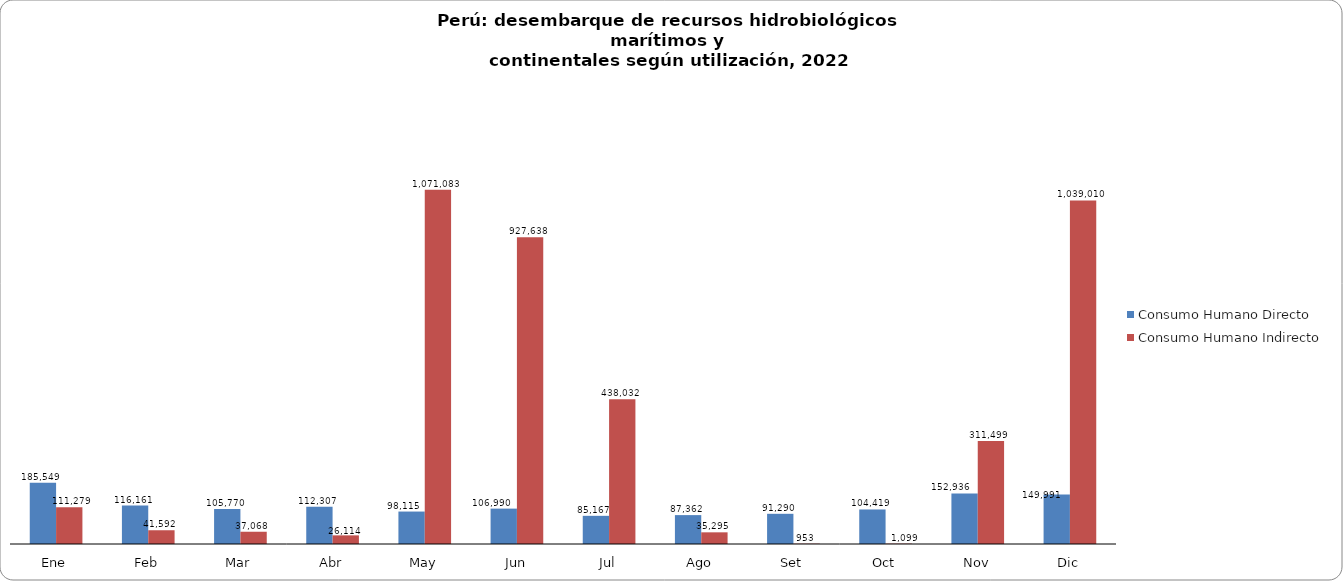
| Category | Consumo Humano Directo | Consumo Humano Indirecto |
|---|---|---|
| Ene | 185548.715 | 111278.93 |
| Feb | 116161.361 | 41592.191 |
| Mar | 105769.875 | 37067.502 |
| Abr | 112306.741 | 26113.774 |
| May | 98115.416 | 1071082.962 |
| Jun | 106990.014 | 927637.592 |
| Jul | 85166.74 | 438031.839 |
| Ago | 87361.796 | 35295.363 |
| Set | 91289.712 | 953.488 |
| Oct | 104418.741 | 1098.579 |
| Nov | 152935.83 | 311498.575 |
| Dic | 149991.291 | 1039009.875 |